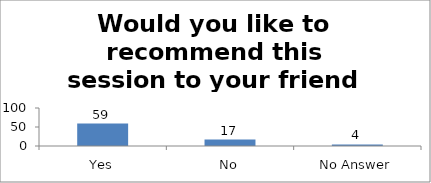
| Category | Would you like to recommend this session to your friend or colleague? |
|---|---|
| Yes | 59 |
| No | 17 |
| No Answer | 4 |